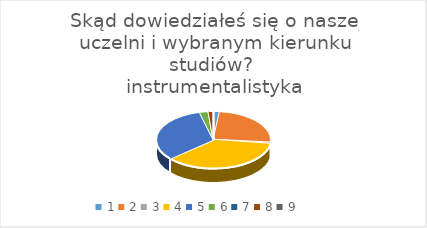
| Category | Series 0 |
|---|---|
| 0 | 5 |
| 1 | 70 |
| 2 | 2 |
| 3 | 103 |
| 4 | 92 |
| 5 | 7 |
| 6 | 0 |
| 7 | 4 |
| 8 | 0 |